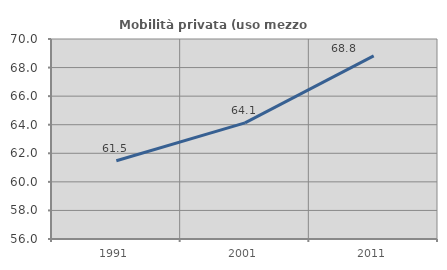
| Category | Mobilità privata (uso mezzo privato) |
|---|---|
| 1991.0 | 61.474 |
| 2001.0 | 64.133 |
| 2011.0 | 68.814 |